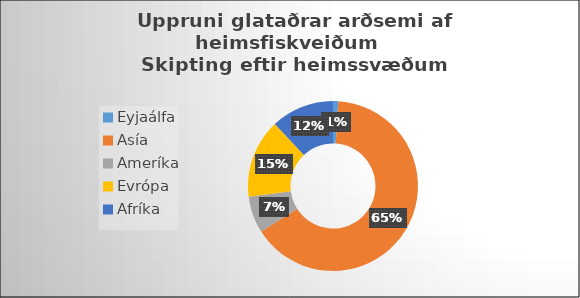
| Category | Series 0 |
|---|---|
| Eyjaálfa | 0.01 |
| Asía | 0.65 |
| Ameríka | 0.07 |
| Evrópa | 0.15 |
| Afríka | 0.12 |